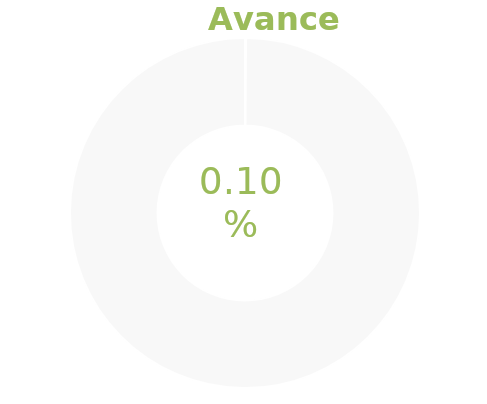
| Category | Series 0 |
|---|---|
| Acumulado 1 Trimestre | 0.001 |
| Año | -0.999 |